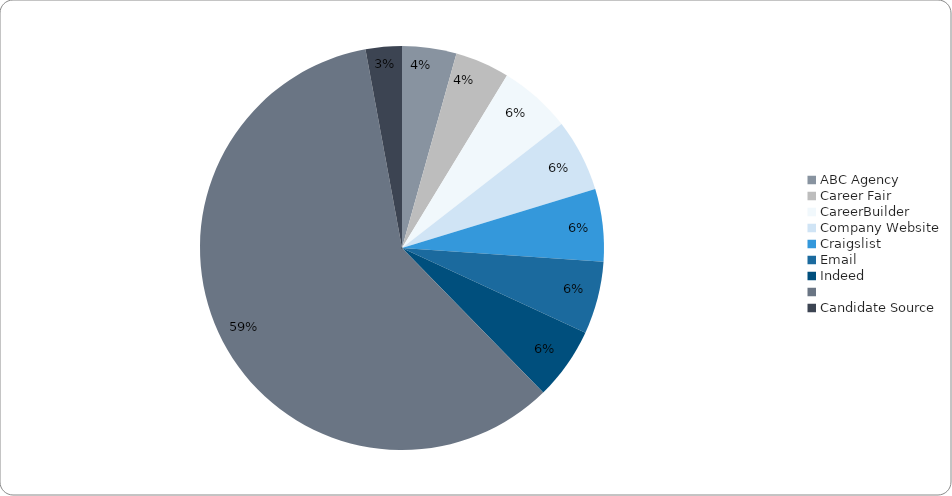
| Category | Series 0 |
|---|---|
| ABC Agency | 3 |
| Career Fair | 3 |
| CareerBuilder | 4 |
| Company Website | 4 |
| Craigslist | 4 |
| Email | 4 |
| Indeed | 4 |
|  | 41 |
| Candidate Source | 2 |